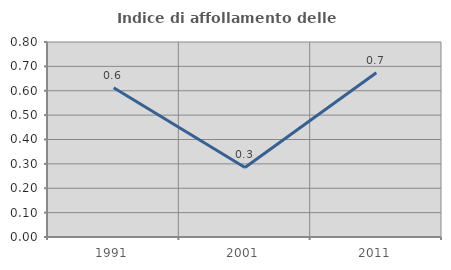
| Category | Indice di affollamento delle abitazioni  |
|---|---|
| 1991.0 | 0.613 |
| 2001.0 | 0.285 |
| 2011.0 | 0.674 |